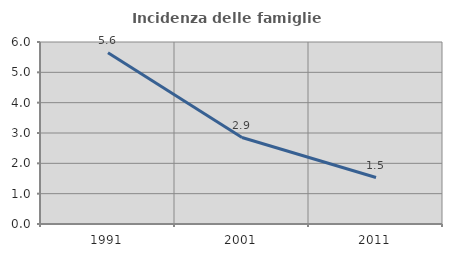
| Category | Incidenza delle famiglie numerose |
|---|---|
| 1991.0 | 5.642 |
| 2001.0 | 2.851 |
| 2011.0 | 1.531 |